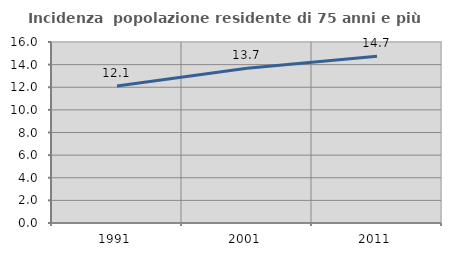
| Category | Incidenza  popolazione residente di 75 anni e più |
|---|---|
| 1991.0 | 12.119 |
| 2001.0 | 13.672 |
| 2011.0 | 14.746 |